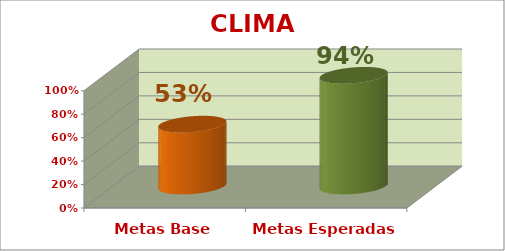
| Category | CLIMA ESCOLAR |
|---|---|
| Metas Base | 0.528 |
| Metas Esperadas | 0.944 |